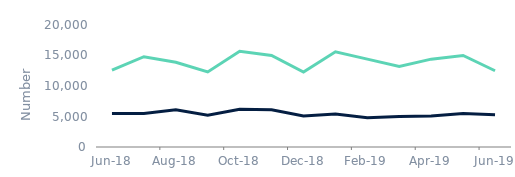
| Category | House purchase | Remortgage |
|---|---|---|
| 2018-06-01 | 5500 | 12600 |
| 2018-07-01 | 5500 | 14800 |
| 2018-08-01 | 6100 | 13900 |
| 2018-09-01 | 5200 | 12300 |
| 2018-10-01 | 6200 | 15700 |
| 2018-11-01 | 6100 | 15000 |
| 2018-12-01 | 5100 | 12300 |
| 2019-01-01 | 5400 | 15600 |
| 2019-02-01 | 4800 | 14400 |
| 2019-03-01 | 5000 | 13200 |
| 2019-04-01 | 5100 | 14400 |
| 2019-05-01 | 5500 | 15000 |
| 2019-06-01 | 5300 | 12500 |